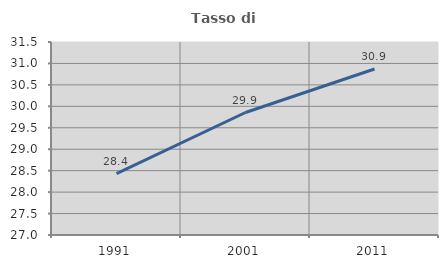
| Category | Tasso di occupazione   |
|---|---|
| 1991.0 | 28.432 |
| 2001.0 | 29.856 |
| 2011.0 | 30.87 |